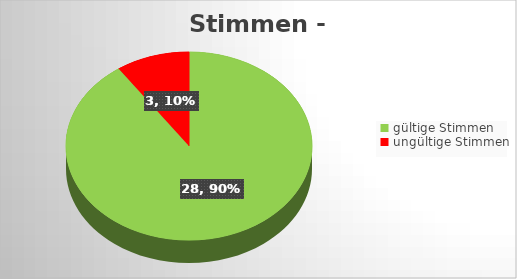
| Category | Series 0 |
|---|---|
| gültige Stimmen | 28 |
| ungültige Stimmen | 3 |